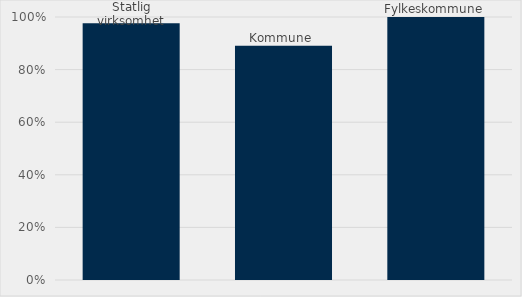
| Category | Estimert verdi som har miljø som kravspesifikasjon(%) |
|---|---|
| Statlig virksomhet | 0.976 |
| Kommune  | 0.891 |
| Fylkeskommune | 1 |